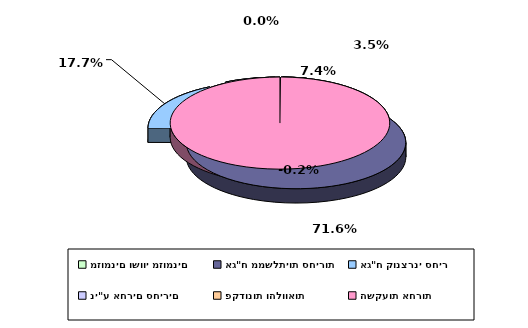
| Category | Series 0 |
|---|---|
| מזומנים ושווי מזומנים | 0.035 |
| אג"ח ממשלתיות סחירות | 0.716 |
| אג"ח קונצרני סחיר | 0.177 |
| ני"ע אחרים סחירים | 0.074 |
| פקדונות והלוואות | 0 |
| השקעות אחרות | -0.002 |